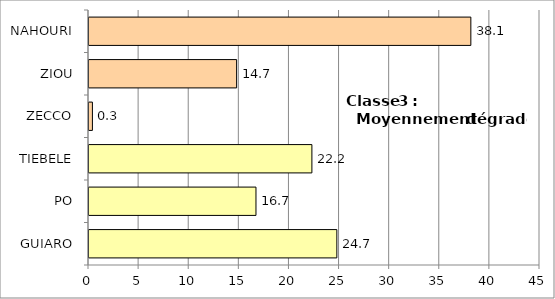
| Category | Series 0 |
|---|---|
| GUIARO | 24.73 |
| PO | 16.66 |
| TIEBELE | 22.24 |
| ZECCO | 0.34 |
| ZIOU | 14.73 |
| NAHOURI | 38.101 |